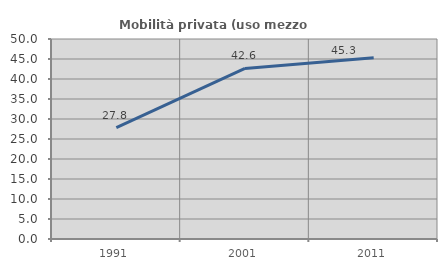
| Category | Mobilità privata (uso mezzo privato) |
|---|---|
| 1991.0 | 27.821 |
| 2001.0 | 42.636 |
| 2011.0 | 45.288 |